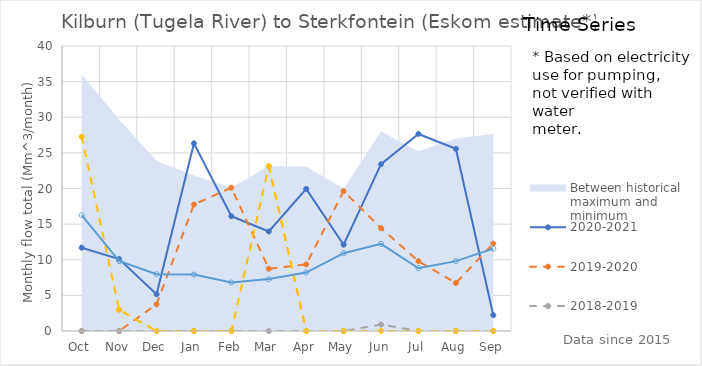
| Category | 2020-2021 | 2019-2020 | 2018-2019 | 2017-2018 | Mean total series |
|---|---|---|---|---|---|
| Oct | 11.695 | 0 | 0 | 27.256 | 16.248 |
| Nov | 10.089 | 0 | 0 | 2.976 | 9.822 |
| Dec | 5.151 | 3.736 | 0 | 0 | 7.982 |
| Jan | 26.343 | 17.76 | 0 | 0 | 7.916 |
| Feb | 16.103 | 20.115 | 0 | 0 | 6.813 |
| Mar | 13.97 | 8.732 | 0 | 23.152 | 7.283 |
| Apr | 19.941 | 9.349 | 0 | 0 | 8.207 |
| May | 12.108 | 19.627 | 0 | 0 | 10.922 |
| Jun | 23.416 | 14.44 | 0.907 | 0 | 12.239 |
| Jul | 27.655 | 9.797 | 0 | 0 | 8.81 |
| Aug | 25.565 | 6.733 | 0 | 0 | 9.806 |
| Sep | 2.219 | 12.268 | 0 | 0 | 11.562 |